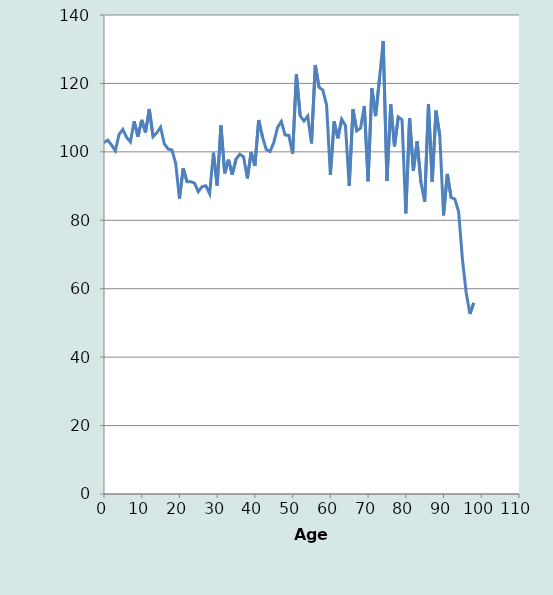
| Category | Sex ratio |
|---|---|
| 0.0 | 102.715 |
| 1.0 | 103.422 |
| 2.0 | 101.988 |
| 3.0 | 100.338 |
| 4.0 | 105.13 |
| 5.0 | 106.557 |
| 6.0 | 104.203 |
| 7.0 | 102.915 |
| 8.0 | 108.952 |
| 9.0 | 104.383 |
| 10.0 | 109.355 |
| 11.0 | 105.684 |
| 12.0 | 112.517 |
| 13.0 | 104.438 |
| 14.0 | 105.578 |
| 15.0 | 107.21 |
| 16.0 | 102.297 |
| 17.0 | 100.885 |
| 18.0 | 100.548 |
| 19.0 | 96.654 |
| 20.0 | 86.323 |
| 21.0 | 95.215 |
| 22.0 | 91.281 |
| 23.0 | 91.289 |
| 24.0 | 90.856 |
| 25.0 | 88.351 |
| 26.0 | 89.835 |
| 27.0 | 90.081 |
| 28.0 | 87.785 |
| 29.0 | 99.752 |
| 30.0 | 90.161 |
| 31.0 | 107.703 |
| 32.0 | 93.741 |
| 33.0 | 97.705 |
| 34.0 | 93.354 |
| 35.0 | 97.898 |
| 36.0 | 99.315 |
| 37.0 | 98.517 |
| 38.0 | 92.231 |
| 39.0 | 99.907 |
| 40.0 | 95.883 |
| 41.0 | 109.311 |
| 42.0 | 104.382 |
| 43.0 | 100.712 |
| 44.0 | 100.092 |
| 45.0 | 102.697 |
| 46.0 | 107.146 |
| 47.0 | 108.875 |
| 48.0 | 104.949 |
| 49.0 | 104.792 |
| 50.0 | 99.477 |
| 51.0 | 122.679 |
| 52.0 | 110.537 |
| 53.0 | 108.998 |
| 54.0 | 110.45 |
| 55.0 | 102.466 |
| 56.0 | 125.401 |
| 57.0 | 118.861 |
| 58.0 | 118.059 |
| 59.0 | 113.693 |
| 60.0 | 93.271 |
| 61.0 | 108.91 |
| 62.0 | 103.976 |
| 63.0 | 109.536 |
| 64.0 | 107.663 |
| 65.0 | 90.019 |
| 66.0 | 112.443 |
| 67.0 | 106.133 |
| 68.0 | 106.921 |
| 69.0 | 113.392 |
| 70.0 | 91.418 |
| 71.0 | 118.665 |
| 72.0 | 110.434 |
| 73.0 | 121.143 |
| 74.0 | 132.424 |
| 75.0 | 91.492 |
| 76.0 | 113.836 |
| 77.0 | 101.622 |
| 78.0 | 110.187 |
| 79.0 | 109.39 |
| 80.0 | 82.016 |
| 81.0 | 109.89 |
| 82.0 | 94.498 |
| 83.0 | 103.103 |
| 84.0 | 91.107 |
| 85.0 | 85.398 |
| 86.0 | 113.866 |
| 87.0 | 91.282 |
| 88.0 | 112.054 |
| 89.0 | 104.717 |
| 90.0 | 81.422 |
| 91.0 | 93.548 |
| 92.0 | 86.667 |
| 93.0 | 86.207 |
| 94.0 | 82.5 |
| 95.0 | 68.657 |
| 96.0 | 58.824 |
| 97.0 | 52.632 |
| 98.0 | 55.862 |